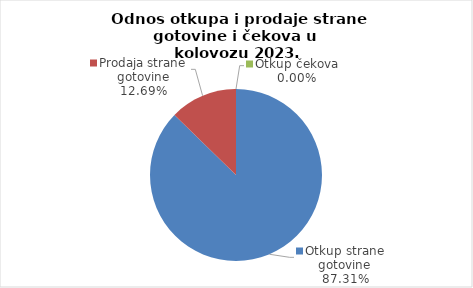
| Category | Series 0 |
|---|---|
| Otkup strane gotovine | 87.311 |
| Prodaja strane gotovine | 12.689 |
| Otkup čekova | 0 |